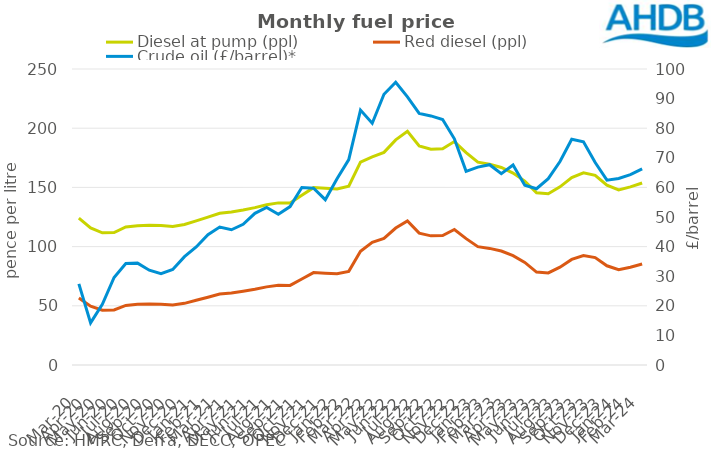
| Category | Diesel at pump (ppl) | Red diesel (ppl) |
|---|---|---|
| Mar-20 | 124.09 | 56.6 |
| Apr-20 | 115.81 | 49.7 |
| May-20 | 111.62 | 46.21 |
| Jun-20 | 111.9 | 46.44 |
| Jul-20 | 116.55 | 50.32 |
| Aug-20 | 117.67 | 51.25 |
| Sep-20 | 118 | 51.52 |
| Oct-20 | 117.85 | 51.4 |
| Nov-20 | 117.05 | 50.73 |
| Dec-20 | 118.66 | 52.07 |
| Jan-21 | 121.73 | 54.63 |
| Feb-21 | 124.91 | 57.28 |
| Mar-21 | 128.11 | 59.95 |
| Apr-21 | 129.22 | 60.87 |
| May-21 | 130.93 | 62.3 |
| Jun-21 | 132.91 | 63.95 |
| Jul-21 | 135.37 | 66 |
| Aug-21 | 136.92 | 67.29 |
| Sep-21 | 136.84 | 67.22 |
| Oct-21 | 143.28 | 72.59 |
| Nov-21 | 149.81 | 78.04 |
| Dec-21 | 149.2 | 77.52 |
| Jan-22 | 148.74 | 77.14 |
| Feb-22 | 151.08 | 79.09 |
| Mar-22 | 171.39 | 96.02 |
| Apr-22 | 175.72 | 103.67 |
| May-22 | 179.58 | 106.88 |
| Jun-22 | 190.15 | 115.69 |
| Jul-22 | 197.38 | 121.71 |
| Aug-22 | 184.95 | 111.36 |
| Sep-22 | 182.22 | 109.08 |
| Oct-22 | 182.56 | 109.36 |
| Nov-22 | 188.72 | 114.49 |
| Dec-22 | 179.41 | 106.74 |
| Jan-23 | 171.27 | 99.96 |
| Feb-23 | 169.5 | 98.48 |
| Mar-23 | 166.83 | 96.26 |
| Apr-23 | 162.09 | 92.31 |
| May-23 | 155.29 | 86.64 |
| Jun-23 | 145.47 | 78.45 |
| Jul-23 | 144.64 | 77.76 |
| Aug-23 | 150.46 | 82.61 |
| Sep-23 | 158.34 | 89.18 |
| Oct-23 | 162.29 | 92.47 |
| Nov-23 | 160.22 | 90.74 |
| Dec-23 | 151.87 | 83.79 |
| Jan-24 | 147.83 | 80.42 |
| Feb-24 | 150.45 | 82.61 |
| Mar-24 | 153.72 | 85.33 |